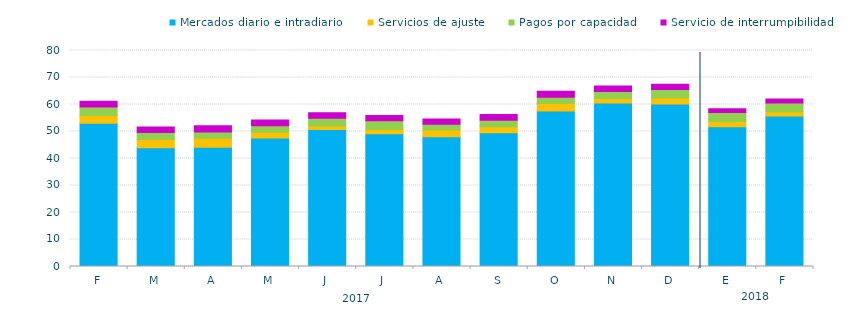
| Category | Mercados diario e intradiario  | Servicios de ajuste | Pagos por capacidad | Servicio de interrumpibilidad |
|---|---|---|---|---|
| F | 53.05 | 2.84 | 3.17 | 2.17 |
| M | 43.94 | 3.13 | 2.52 | 2.06 |
| A | 44.2 | 3.27 | 2.38 | 2.28 |
| M | 47.6 | 2.13 | 2.37 | 2.15 |
| J | 50.77 | 1.25 | 2.91 | 2 |
| J | 49.13 | 1.65 | 3.22 | 1.93 |
| A | 48.03 | 2.49 | 2.16 | 1.99 |
| S | 49.52 | 2.2 | 2.41 | 2.14 |
| O | 57.59 | 2.78 | 2.34 | 2.16 |
| N | 60.54 | 1.66 | 2.58 | 2.08 |
| D | 60.16 | 2.24 | 3.15 | 1.96 |
| E | 51.77 | 1.95 | 3.3 | 1.38 |
| F | 55.76 | 1.57 | 3.25 | 1.46 |